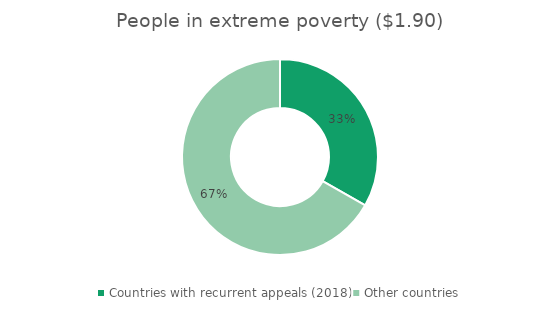
| Category | $1.90 poverty line |
|---|---|
| Countries with recurrent appeals (2018) | 231.403 |
| Other countries | 465.424 |